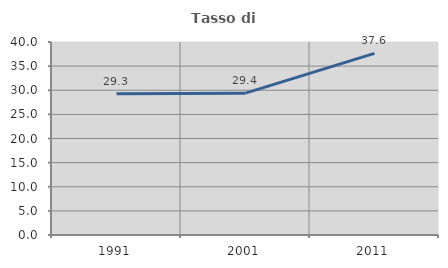
| Category | Tasso di occupazione   |
|---|---|
| 1991.0 | 29.252 |
| 2001.0 | 29.401 |
| 2011.0 | 37.644 |